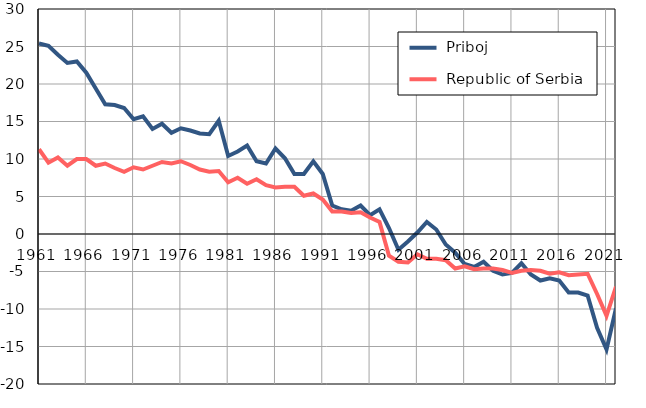
| Category |  Priboj |  Republic of Serbia |
|---|---|---|
| 1961.0 | 25.4 | 11.3 |
| 1962.0 | 25.1 | 9.5 |
| 1963.0 | 23.9 | 10.2 |
| 1964.0 | 22.8 | 9.1 |
| 1965.0 | 23 | 10 |
| 1966.0 | 21.5 | 10 |
| 1967.0 | 19.4 | 9.1 |
| 1968.0 | 17.3 | 9.4 |
| 1969.0 | 17.2 | 8.8 |
| 1970.0 | 16.8 | 8.3 |
| 1971.0 | 15.3 | 8.9 |
| 1972.0 | 15.7 | 8.6 |
| 1973.0 | 14 | 9.1 |
| 1974.0 | 14.7 | 9.6 |
| 1975.0 | 13.5 | 9.4 |
| 1976.0 | 14.1 | 9.7 |
| 1977.0 | 13.8 | 9.2 |
| 1978.0 | 13.4 | 8.6 |
| 1979.0 | 13.3 | 8.3 |
| 1980.0 | 15.1 | 8.4 |
| 1981.0 | 10.4 | 6.9 |
| 1982.0 | 11 | 7.5 |
| 1983.0 | 11.8 | 6.7 |
| 1984.0 | 9.7 | 7.3 |
| 1985.0 | 9.4 | 6.5 |
| 1986.0 | 11.4 | 6.2 |
| 1987.0 | 10.1 | 6.3 |
| 1988.0 | 8 | 6.3 |
| 1989.0 | 8 | 5.1 |
| 1990.0 | 9.7 | 5.4 |
| 1991.0 | 8 | 4.6 |
| 1992.0 | 3.8 | 3 |
| 1993.0 | 3.3 | 3 |
| 1994.0 | 3.1 | 2.8 |
| 1995.0 | 3.8 | 2.9 |
| 1996.0 | 2.5 | 2.2 |
| 1997.0 | 3.3 | 1.6 |
| 1998.0 | 0.8 | -2.9 |
| 1999.0 | -2.1 | -3.7 |
| 2000.0 | -1 | -3.8 |
| 2001.0 | 0.2 | -2.7 |
| 2002.0 | 1.6 | -3.3 |
| 2003.0 | 0.6 | -3.3 |
| 2004.0 | -1.4 | -3.5 |
| 2005.0 | -2.5 | -4.6 |
| 2006.0 | -4 | -4.3 |
| 2007.0 | -4.4 | -4.7 |
| 2008.0 | -3.7 | -4.6 |
| 2009.0 | -4.9 | -4.6 |
| 2010.0 | -5.4 | -4.8 |
| 2011.0 | -5.2 | -5.2 |
| 2012.0 | -3.9 | -4.9 |
| 2013.0 | -5.4 | -4.8 |
| 2014.0 | -6.2 | -4.9 |
| 2015.0 | -5.9 | -5.3 |
| 2016.0 | -6.2 | -5.1 |
| 2017.0 | -7.8 | -5.5 |
| 2018.0 | -7.8 | -5.4 |
| 2019.0 | -8.2 | -5.3 |
| 2020.0 | -12.5 | -8 |
| 2021.0 | -15.4 | -10.9 |
| 2022.0 | -9.9 | -7 |